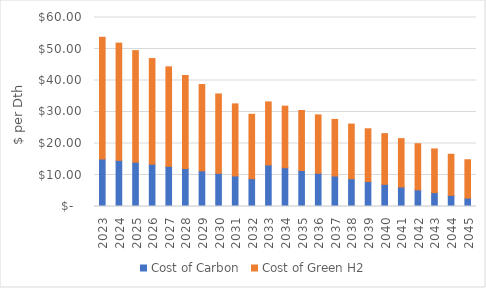
| Category | Cost of Carbon | Cost of Green H2 |
|---|---|---|
| 2023.0 | 15.072 | 38.644 |
| 2024.0 | 14.644 | 37.222 |
| 2025.0 | 14.061 | 35.425 |
| 2026.0 | 13.427 | 33.539 |
| 2027.0 | 12.758 | 31.579 |
| 2028.0 | 12.052 | 29.539 |
| 2029.0 | 11.305 | 27.414 |
| 2030.0 | 10.519 | 25.202 |
| 2031.0 | 9.693 | 22.884 |
| 2032.0 | 8.825 | 20.442 |
| 2033.0 | 13.19 | 20.007 |
| 2034.0 | 12.312 | 19.543 |
| 2035.0 | 11.434 | 19.049 |
| 2036.0 | 10.556 | 18.523 |
| 2037.0 | 9.678 | 17.965 |
| 2038.0 | 8.8 | 17.374 |
| 2039.0 | 7.922 | 16.748 |
| 2040.0 | 7.044 | 16.086 |
| 2041.0 | 6.166 | 15.387 |
| 2042.0 | 5.288 | 14.649 |
| 2043.0 | 4.41 | 13.871 |
| 2044.0 | 3.532 | 13.052 |
| 2045.0 | 2.654 | 12.19 |